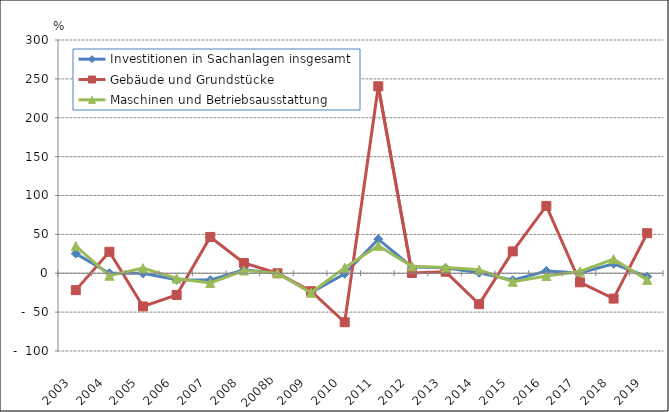
| Category | Investitionen in Sachanlagen insgesamt | Gebäude und Grundstücke | Maschinen und Betriebsausstattung |
|---|---|---|---|
| 2003  | 25.3 | -21.7 | 35 |
| 2004  | 0.1 | 27.6 | -3.2 |
| 2005  | -0.1 | -42.7 | 6.6 |
| 2006  | -8.473 | -27.938 | -6.81 |
| 2007  | -8.766 | 46.686 | -12.43 |
| 2008  | 4.511 | 13.27 | 3.542 |
| 2008b | 0 | 0 | 0 |
| 2009  | -24.896 | -23.131 | -25.113 |
| 2010  | -0.603 | -63.012 | 7.236 |
| 2011  | 43.839 | 240.486 | 35.319 |
| 2012  | 8.013 | 0.373 | 8.846 |
| 2013  | 6.929 | 1.955 | 7.43 |
| 2014  | 0.591 | -39.758 | 4.441 |
| 2015  | -8.949 | 28.111 | -10.989 |
| 2016  | 2.982 | 86.615 | -3.643 |
| 2017  | 0.457 | -11.661 | 2.316 |
| 2018  | 12.174 | -32.584 | 18.102 |
| 2019  | -4.302 | 51.525 | -8.522 |